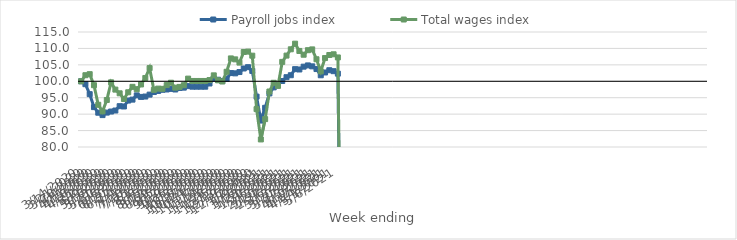
| Category | Payroll jobs index | Total wages index |
|---|---|---|
| 14/03/2020 | 100 | 100 |
| 21/03/2020 | 99.116 | 101.848 |
| 28/03/2020 | 96.081 | 102.168 |
| 04/04/2020 | 92.139 | 98.807 |
| 11/04/2020 | 90.436 | 92.846 |
| 18/04/2020 | 89.709 | 90.843 |
| 25/04/2020 | 90.468 | 94.313 |
| 02/05/2020 | 90.794 | 99.678 |
| 09/05/2020 | 91.103 | 97.463 |
| 16/05/2020 | 92.425 | 96.344 |
| 23/05/2020 | 92.334 | 94.615 |
| 30/05/2020 | 94.134 | 96.654 |
| 06/06/2020 | 94.421 | 98.313 |
| 13/06/2020 | 95.712 | 97.598 |
| 20/06/2020 | 95.241 | 99.035 |
| 27/06/2020 | 95.356 | 101.008 |
| 04/07/2020 | 95.943 | 104.013 |
| 11/07/2020 | 96.732 | 97.391 |
| 18/07/2020 | 97.06 | 97.772 |
| 25/07/2020 | 97.411 | 97.704 |
| 01/08/2020 | 97.502 | 98.849 |
| 08/08/2020 | 97.683 | 99.562 |
| 15/08/2020 | 97.5 | 98.052 |
| 22/08/2020 | 97.971 | 98.287 |
| 29/08/2020 | 98.069 | 98.816 |
| 05/09/2020 | 98.525 | 100.814 |
| 12/09/2020 | 98.356 | 100.096 |
| 19/09/2020 | 98.356 | 100.096 |
| 26/09/2020 | 98.356 | 100.096 |
| 03/10/2020 | 98.356 | 100.096 |
| 10/10/2020 | 99.327 | 100.373 |
| 17/10/2020 | 100.785 | 101.806 |
| 24/10/2020 | 100.472 | 100.296 |
| 31/10/2020 | 100.068 | 99.939 |
| 07/11/2020 | 100.751 | 102.896 |
| 14/11/2020 | 102.503 | 106.96 |
| 21/11/2020 | 102.413 | 106.67 |
| 28/11/2020 | 102.815 | 105.688 |
| 05/12/2020 | 103.894 | 108.92 |
| 12/12/2020 | 104.296 | 109.037 |
| 19/12/2020 | 103.153 | 107.791 |
| 26/12/2020 | 95.335 | 91.526 |
| 02/01/2021 | 88.042 | 82.301 |
| 09/01/2021 | 91.931 | 88.486 |
| 16/01/2021 | 96.315 | 96.891 |
| 23/01/2021 | 98.148 | 99.542 |
| 30/01/2021 | 98.86 | 98.595 |
| 06/02/2021 | 100.093 | 105.903 |
| 13/02/2021 | 101.246 | 107.824 |
| 20/02/2021 | 101.842 | 109.737 |
| 27/02/2021 | 103.692 | 111.447 |
| 06/03/2021 | 103.594 | 109.229 |
| 13/03/2021 | 104.451 | 108.083 |
| 20/03/2021 | 104.83 | 109.464 |
| 27/03/2021 | 104.544 | 109.706 |
| 03/04/2021 | 103.723 | 106.705 |
| 10/04/2021 | 101.828 | 103.026 |
| 17/04/2021 | 102.68 | 107.07 |
| 24/04/2021 | 103.367 | 108.001 |
| 01/05/2021 | 103.074 | 108.219 |
| 08/05/2021 | 102.324 | 107.262 |